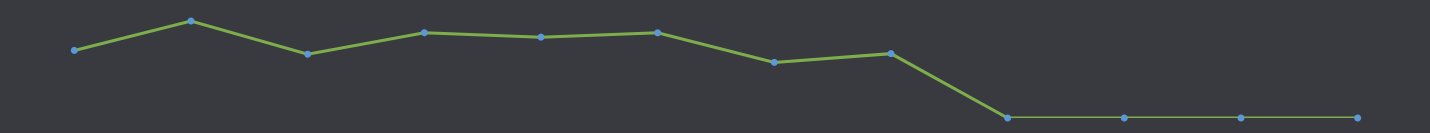
| Category | Tiền mặt Có sẵn |
|---|---|
| THÁNG 1 | 22960000 |
| THÁNG 2 | 32956000 |
| THÁNG 3 | 21672000 |
| THÁNG 4 | 28980000 |
| THÁNG 5 | 27468000 |
| THÁNG 6 | 28952000 |
| THÁNG 7 | 18900000 |
| THÁNG 8 | 21868000 |
| THÁNG 9 | 0 |
| THÁNG 10 | 0 |
| THÁNG 11 | 0 |
| THÁNG 12 | 0 |